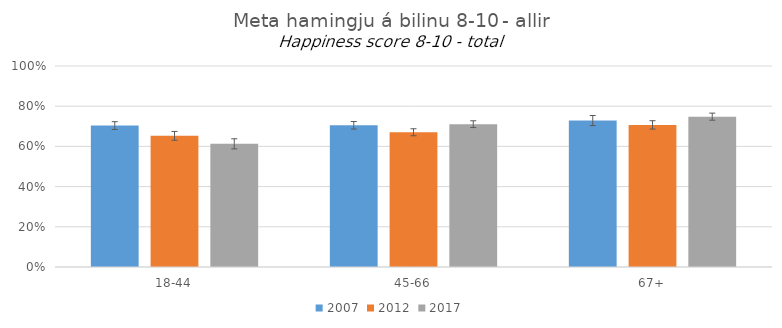
| Category | 2007 | 2012 | 2017 |
|---|---|---|---|
| 18-44 | 0.704 | 0.652 | 0.613 |
| 45-66 | 0.705 | 0.67 | 0.711 |
| 67+ | 0.729 | 0.707 | 0.748 |